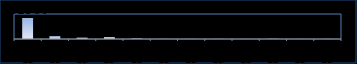
| Category | Series 0 |
|---|---|
| Jan 15 | 41966 |
| Feb 15 | 5772 |
| Mar 15 | 2654 |
| Apr 15 | 3973 |
| May 15 | 1186 |
| Jun 15 | 167 |
| Jul 15 | 210 |
| Aug 15 | 206 |
| Sep 15 | 100 |
| Oct 15 | 421 |
| Nov 15 | 141 |
| Dec 15 | 187 |